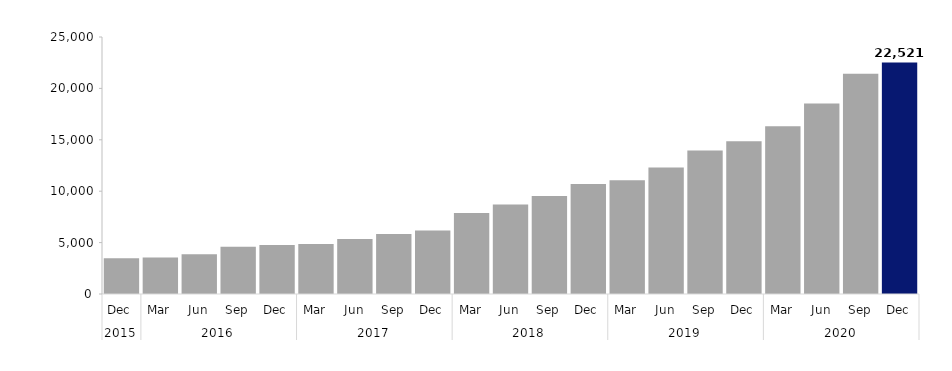
| Category | Series 0 |
|---|---|
| 0 | 3476 |
| 1 | 3549 |
| 2 | 3877 |
| 3 | 4602 |
| 4 | 4771 |
| 5 | 4865 |
| 6 | 5353 |
| 7 | 5844 |
| 8 | 6182 |
| 9 | 7890 |
| 10 | 8704 |
| 11 | 9536 |
| 12 | 10712 |
| 13 | 11067 |
| 14 | 12311 |
| 15 | 13966 |
| 16 | 14869 |
| 17 | 16309 |
| 18 | 18520 |
| 19 | 21415 |
| 20 | 22521 |